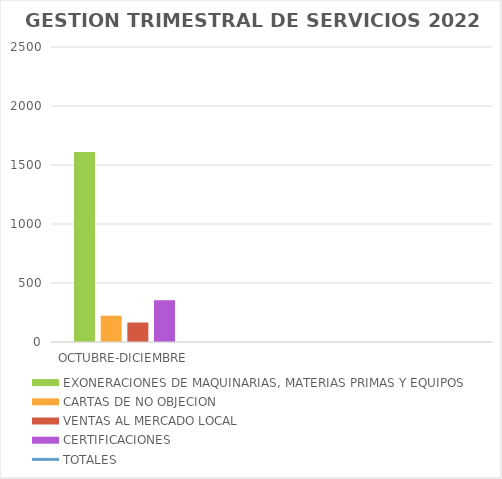
| Category | EXONERACIONES DE MAQUINARIAS, MATERIAS PRIMAS Y EQUIPOS | CARTAS DE NO OBJECION | VENTAS AL MERCADO LOCAL | CERTIFICACIONES |
|---|---|---|---|---|
| OCTUBRE-DICIEMBRE | 1611 | 223 | 165 | 354 |